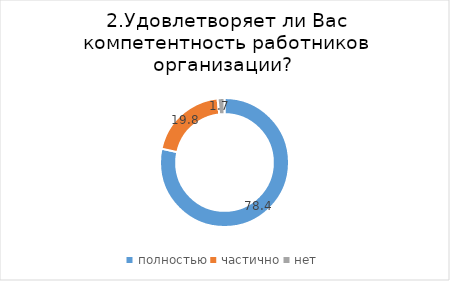
| Category | Series 0 |
|---|---|
| полностью | 78.448 |
| частично | 19.828 |
| нет | 1.724 |